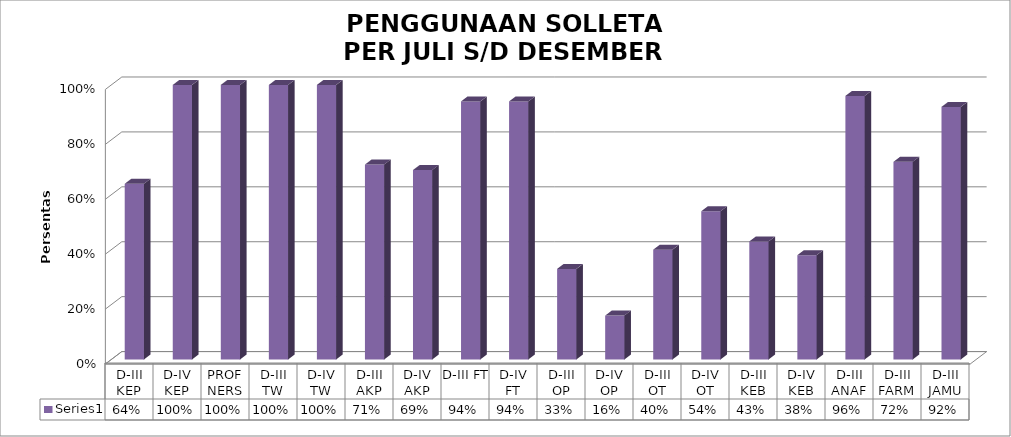
| Category | Series 0 |
|---|---|
| D-III KEP | 0.64 |
| D-IV KEP | 1 |
| PROF NERS | 1 |
| D-III TW | 1 |
| D-IV TW | 1 |
| D-III AKP | 0.71 |
| D-IV AKP | 0.69 |
| D-III FT | 0.94 |
| D-IV FT | 0.94 |
| D-III OP | 0.33 |
| D-IV OP | 0.16 |
| D-III OT | 0.4 |
| D-IV OT | 0.54 |
| D-III KEB | 0.43 |
| D-IV KEB | 0.38 |
| D-III ANAF | 0.96 |
| D-III FARM | 0.72 |
| D-III JAMU | 0.92 |